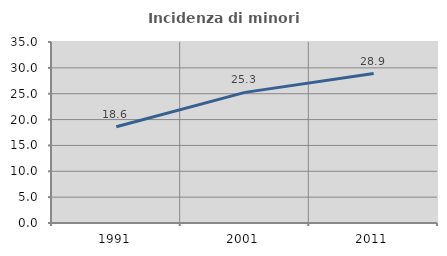
| Category | Incidenza di minori stranieri |
|---|---|
| 1991.0 | 18.605 |
| 2001.0 | 25.258 |
| 2011.0 | 28.897 |